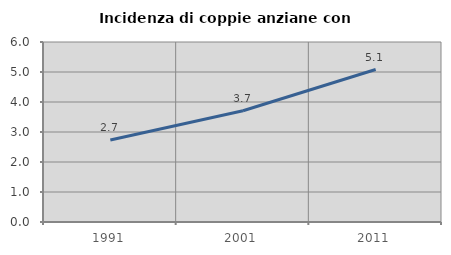
| Category | Incidenza di coppie anziane con figli |
|---|---|
| 1991.0 | 2.733 |
| 2001.0 | 3.709 |
| 2011.0 | 5.083 |